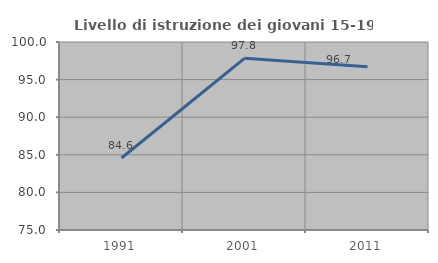
| Category | Livello di istruzione dei giovani 15-19 anni |
|---|---|
| 1991.0 | 84.579 |
| 2001.0 | 97.826 |
| 2011.0 | 96.711 |